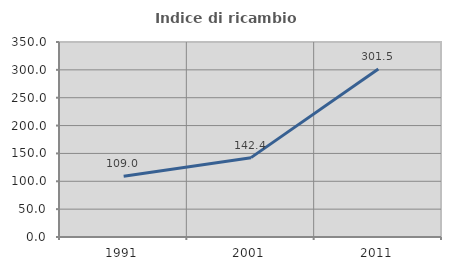
| Category | Indice di ricambio occupazionale  |
|---|---|
| 1991.0 | 109.02 |
| 2001.0 | 142.439 |
| 2011.0 | 301.504 |